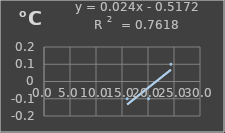
| Category | Temperatura |
|---|---|
| 16.0 | -0.1 |
| 20.1 | -0.1 |
| 24.4 | 0.1 |